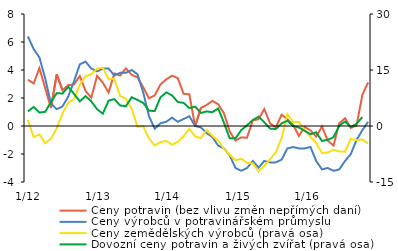
| Category | Ceny potravin (bez vlivu změn nepřímých daní) | Ceny výrobců v potravinářském průmyslu |
|---|---|---|
|  1/12 | 3.311 | 6.4 |
| 2 | 3.036 | 5.5 |
| 3 | 4.13 | 4.9 |
| 4 | 2.702 | 3.4 |
| 5 | 1.287 | 1.6 |
| 6 | 3.686 | 1.2 |
| 7 | 2.554 | 1.4 |
| 8 | 2.92 | 2.1 |
| 9 | 2.967 | 3.2 |
| 10 | 3.572 | 4.4 |
| 11 | 2.506 | 4.6 |
| 12 | 2.015 | 4.1 |
|  1/13 | 3.583 | 3.9 |
| 2 | 3.091 | 4.1 |
| 3 | 2.394 | 4.1 |
| 4 | 3.758 | 3.6 |
| 5 | 3.601 | 3.8 |
| 6 | 4.119 | 3.8 |
| 7 | 3.656 | 4 |
| 8 | 3.475 | 3.7 |
| 9 | 2.771 | 2.4 |
| 10 | 1.976 | 0.7 |
| 11 | 2.189 | -0.2 |
| 12 | 2.971 | 0.2 |
|  1/14 | 3.33 | 0.3 |
| 2 | 3.598 | 0.6 |
| 3 | 3.419 | 0.3 |
| 4 | 2.299 | 0.5 |
| 5 | 2.261 | 0.7 |
| 6 | -0.023 | 0 |
| 7 | 1.287 | -0.1 |
| 8 | 1.502 | -0.5 |
| 9 | 1.79 | -0.8 |
| 10 | 1.558 | -1.4 |
| 11 | 0.908 | -1.6 |
| 12 | -0.394 | -2.1 |
|   1/15 | -1.038 | -3 |
| 2 | -0.812 | -3.2 |
| 3 | -0.84 | -3 |
| 4 | 0.392 | -2.5 |
| 5 | 0.486 | -2.973 |
| 6 | 1.21 | -2.5 |
| 7 | 0.185 | -2.6 |
| 8 | -0.093 | -2.6 |
| 9 | 0.807 | -2.4 |
| 10 | 0.479 | -1.6 |
| 11 | 0.088 | -1.5 |
| 12 | -0.713 | -1.6 |
|   1/16 | -0.062 | -1.6 |
| 2 | -0.32 | -1.5 |
| 3 | -0.762 | -2.5 |
| 4 | -0.032 | -3.1 |
| 5 | -1.052 | -3 |
| 6 | -1.398 | -3.2 |
| 7 | 0.197 | -3.1 |
| 8 | 0.556 | -2.5 |
| 9 | -0.132 | -2 |
| 10 | 0.038 | -1 |
| 11 | 2.22 | -0.3 |
| 12 | 3.112 | 0.3 |